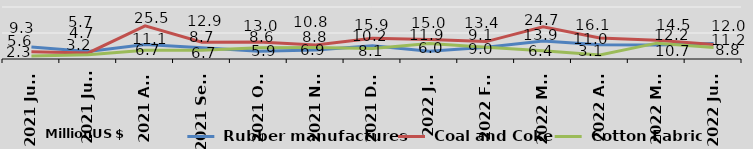
| Category |  Rubber manufactures |  Coal and Coke |  Cotton Fabric |
|---|---|---|---|
| 2021 June | 9.3 | 5.6 | 2.3 |
| 2021 July | 5.7 | 4.7 | 3.2 |
| 2021 Aug | 11.1 | 25.5 | 6.7 |
| 2021 Sept | 8.7 | 12.9 | 6.7 |
| 2021 Oct | 5.9 | 13 | 8.6 |
| 2021 Nov | 6.9 | 10.8 | 8.8 |
| 2021 Dec | 10.2 | 15.9 | 8.1 |
| 2022 Jan | 6 | 15 | 11.9 |
| 2022 Feb | 9.1 | 13.4 | 9 |
| 2022 Mar | 13.9 | 24.7 | 6.4 |
| 2022 Apr | 11 | 16.1 | 3.1 |
| 2022 May | 10.7 | 14.5 | 12.2 |
| 2022 June | 12 | 11.2 | 8.8 |